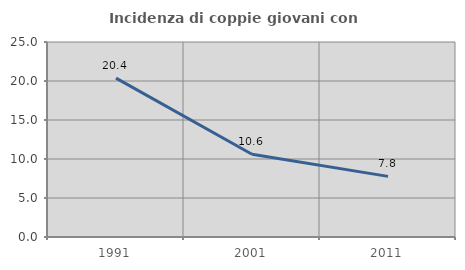
| Category | Incidenza di coppie giovani con figli |
|---|---|
| 1991.0 | 20.373 |
| 2001.0 | 10.601 |
| 2011.0 | 7.77 |